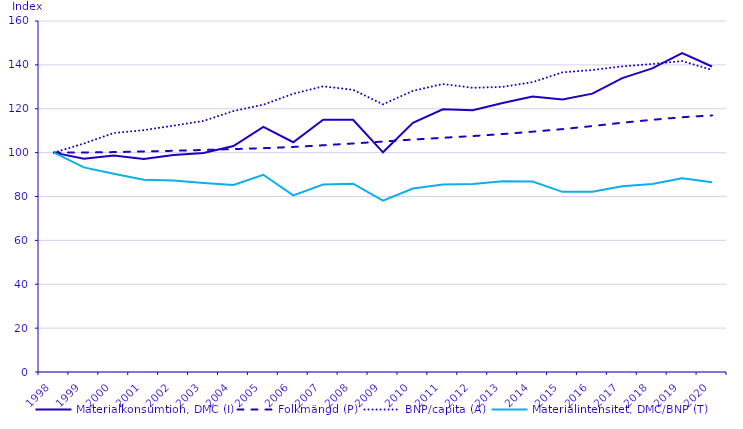
| Category | Materialkonsumtion, DMC (I) | Folkmängd (P) | BNP/capita (A) | Materialintensitet, DMC/BNP (T) |
|---|---|---|---|---|
| 1998.0 | 100 | 100 | 100 | 100 |
| 1999.0 | 97.241 | 100.079 | 104.165 | 93.279 |
| 2000.0 | 98.687 | 100.237 | 108.957 | 90.36 |
| 2001.0 | 97.091 | 100.508 | 110.239 | 87.628 |
| 2002.0 | 98.892 | 100.836 | 112.294 | 87.335 |
| 2003.0 | 99.824 | 101.22 | 114.452 | 86.167 |
| 2004.0 | 103.026 | 101.616 | 118.951 | 85.235 |
| 2005.0 | 111.766 | 102.022 | 121.864 | 89.896 |
| 2006.0 | 104.735 | 102.593 | 126.837 | 80.488 |
| 2007.0 | 114.994 | 103.357 | 130.23 | 85.433 |
| 2008.0 | 114.987 | 104.165 | 128.637 | 85.815 |
| 2009.0 | 100.136 | 105.056 | 122.01 | 78.121 |
| 2010.0 | 113.621 | 105.956 | 128.175 | 83.662 |
| 2011.0 | 119.769 | 106.759 | 131.276 | 85.459 |
| 2012.0 | 119.333 | 107.551 | 129.542 | 85.651 |
| 2013.0 | 122.651 | 108.467 | 129.974 | 87 |
| 2014.0 | 125.597 | 109.548 | 132.111 | 86.783 |
| 2015.0 | 124.169 | 110.713 | 136.59 | 82.11 |
| 2016.0 | 126.884 | 112.113 | 137.678 | 82.203 |
| 2017.0 | 133.984 | 113.633 | 139.323 | 84.63 |
| 2018.0 | 138.38 | 114.961 | 140.399 | 85.735 |
| 2019.0 | 145.399 | 116.132 | 141.744 | 88.329 |
| 2020.0 | 139.253 | 116.975 | 137.669 | 86.472 |